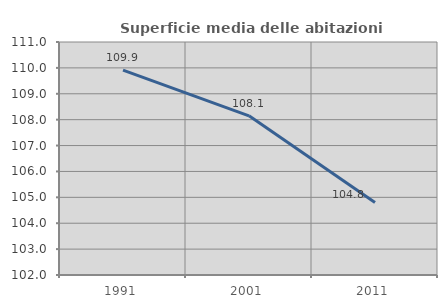
| Category | Superficie media delle abitazioni occupate |
|---|---|
| 1991.0 | 109.912 |
| 2001.0 | 108.149 |
| 2011.0 | 104.804 |